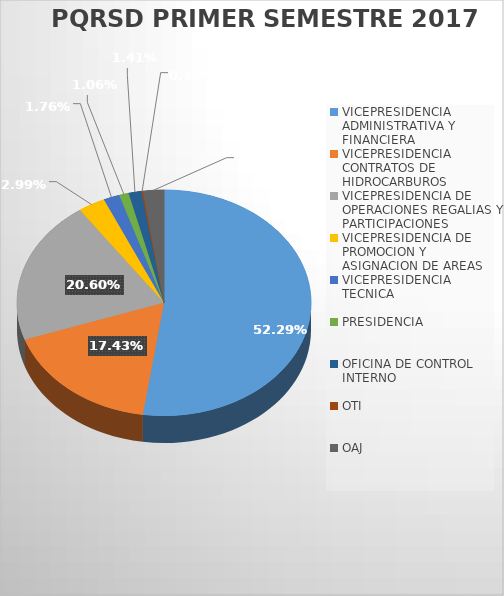
| Category | Series 0 |
|---|---|
| VICEPRESIDENCIA ADMINISTRATIVA Y FINANCIERA | 297 |
| VICEPRESIDENCIA CONTRATOS DE HIDROCARBUROS | 99 |
| VICEPRESIDENCIA DE OPERACIONES REGALIAS Y PARTICIPACIONES | 117 |
| VICEPRESIDENCIA DE PROMOCION Y ASIGNACION DE AREAS | 17 |
| VICEPRESIDENCIA TECNICA | 10 |
| PRESIDENCIA  | 6 |
| OFICINA DE CONTROL INTERNO | 8 |
| OTI | 1 |
| OAJ | 13 |